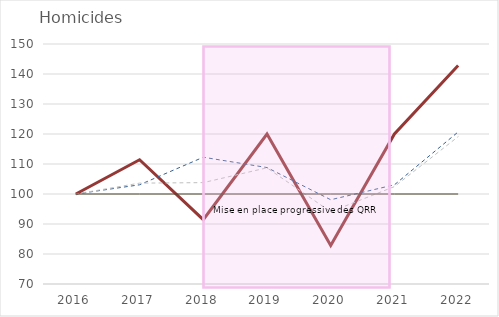
| Category | QRR | Unités urbaines englobantes | Unités urbaines de plus de 10 000 hab. | Series 0 |
|---|---|---|---|---|
| 2016.0 | 100 | 100 | 100 | 100 |
| 2017.0 | 111.429 | 103.065 | 103.624 | 100 |
| 2018.0 | 91.429 | 112.261 | 103.789 | 100 |
| 2019.0 | 120 | 108.812 | 108.731 | 100 |
| 2020.0 | 82.857 | 98.084 | 94.069 | 100 |
| 2021.0 | 120 | 103.065 | 102.471 | 100 |
| 2022.0 | 142.857 | 120.69 | 119.11 | 100 |